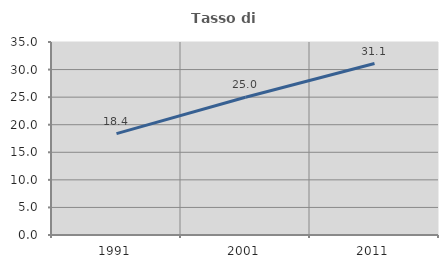
| Category | Tasso di occupazione   |
|---|---|
| 1991.0 | 18.388 |
| 2001.0 | 24.972 |
| 2011.0 | 31.092 |